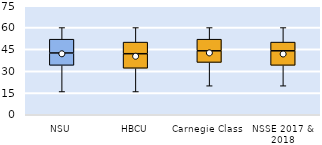
| Category | 25th | 50th | 75th |
|---|---|---|---|
| NSU | 34 | 8.5 | 9.5 |
| HBCU | 32 | 10 | 8 |
| Carnegie Class | 36 | 8 | 8 |
| NSSE 2017 & 2018 | 34 | 10 | 6 |